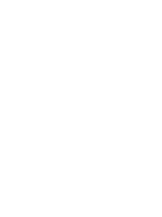
| Category | Series 0 |
|---|---|
| Enthusiasm | 0 |
| Perseverance | 0 |
| Integrity | 0 |
| Self-confidence | 0 |
| Self-reflection | 0 |
| Responsibility | 0 |